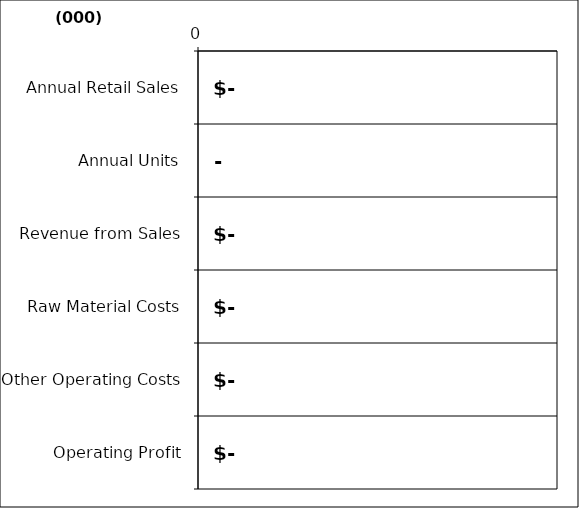
| Category | Series 0 |
|---|---|
| Annual Retail Sales | 0 |
| Annual Units | 0 |
| Revenue from Sales | 0 |
| Raw Material Costs | 0 |
| Other Operating Costs | 0 |
| Operating Profit | 0 |